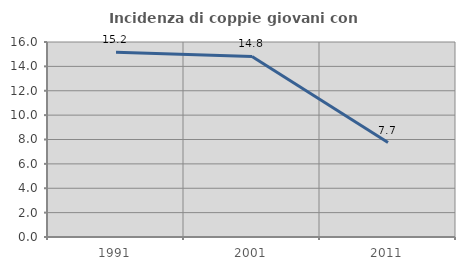
| Category | Incidenza di coppie giovani con figli |
|---|---|
| 1991.0 | 15.152 |
| 2001.0 | 14.815 |
| 2011.0 | 7.746 |